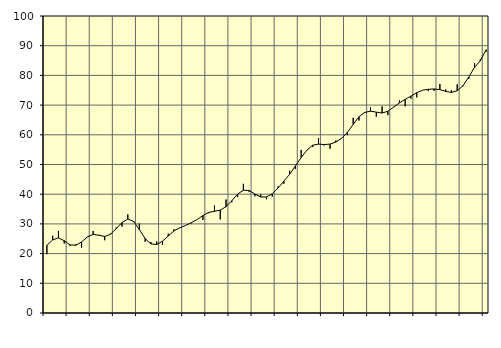
| Category | Piggar | Series 1 |
|---|---|---|
| nan | 19.8 | 22.79 |
| 1.0 | 26 | 24.59 |
| 1.0 | 27.6 | 25.3 |
| 1.0 | 23.4 | 24.34 |
| nan | 22.7 | 22.93 |
| 2.0 | 23.2 | 22.82 |
| 2.0 | 22 | 23.93 |
| 2.0 | 25.7 | 25.58 |
| nan | 27.6 | 26.48 |
| 3.0 | 26.3 | 26.16 |
| 3.0 | 24.5 | 25.77 |
| 3.0 | 26.7 | 26.47 |
| nan | 28.8 | 28.43 |
| 4.0 | 29.1 | 30.46 |
| 4.0 | 33.2 | 31.63 |
| 4.0 | 30.6 | 30.88 |
| nan | 30.1 | 28.1 |
| 5.0 | 24 | 25.06 |
| 5.0 | 23.9 | 23.24 |
| 5.0 | 24.1 | 23.09 |
| nan | 22.9 | 24.16 |
| 6.0 | 26.7 | 25.95 |
| 6.0 | 28.2 | 27.65 |
| 6.0 | 28.6 | 28.67 |
| nan | 29.5 | 29.48 |
| 7.0 | 30.2 | 30.42 |
| 7.0 | 31.4 | 31.45 |
| 7.0 | 31.3 | 32.83 |
| nan | 33.6 | 33.87 |
| 8.0 | 36.2 | 34.24 |
| 8.0 | 31.5 | 34.65 |
| 8.0 | 38.2 | 35.79 |
| nan | 37.3 | 37.82 |
| 9.0 | 39 | 40.04 |
| 9.0 | 43.5 | 41.34 |
| 9.0 | 40.8 | 41.25 |
| nan | 39.3 | 40.06 |
| 10.0 | 39.9 | 39.05 |
| 10.0 | 38.3 | 39.08 |
| 10.0 | 39.2 | 40.14 |
| nan | 42.6 | 42.06 |
| 11.0 | 43.5 | 44.39 |
| 11.0 | 47.9 | 46.7 |
| 11.0 | 48.5 | 49.49 |
| nan | 54.9 | 52.37 |
| 12.0 | 54.8 | 54.82 |
| 12.0 | 55.9 | 56.51 |
| 12.0 | 58.9 | 56.85 |
| nan | 56.4 | 56.72 |
| 13.0 | 55.3 | 56.87 |
| 13.0 | 58.1 | 57.55 |
| 13.0 | 58.8 | 58.82 |
| nan | 59.9 | 60.81 |
| 14.0 | 65.7 | 63.52 |
| 14.0 | 64.8 | 66.07 |
| 14.0 | 67.3 | 67.55 |
| nan | 69.3 | 67.96 |
| 15.0 | 66.1 | 67.63 |
| 15.0 | 69.6 | 67.32 |
| 15.0 | 66.6 | 67.93 |
| nan | 69.3 | 69.34 |
| 16.0 | 71.6 | 70.72 |
| 16.0 | 69.6 | 71.93 |
| 16.0 | 72.2 | 73.05 |
| nan | 72.6 | 74.17 |
| 17.0 | 75 | 75.01 |
| 17.0 | 74.7 | 75.32 |
| 17.0 | 74.8 | 75.44 |
| nan | 77.1 | 75.21 |
| 18.0 | 75.3 | 74.64 |
| 18.0 | 75 | 74.26 |
| 18.0 | 77 | 74.83 |
| nan | 76.3 | 76.54 |
| 19.0 | 78.8 | 79.43 |
| 19.0 | 84.1 | 82.72 |
| 19.0 | 85.5 | 84.93 |
| nan | 88 | 88.62 |